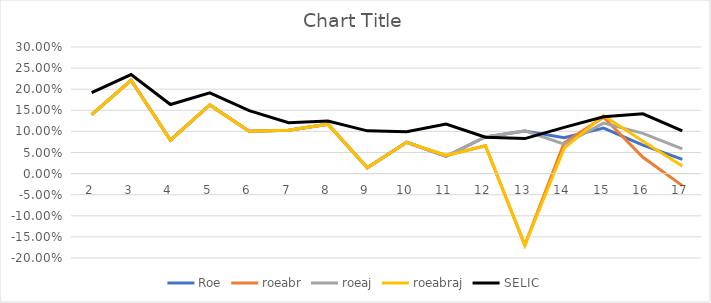
| Category | Roe | roeabr | roeaj | roeabraj | SELIC |
|---|---|---|---|---|---|
| 2.0 | 0.14 | 0.14 | 0.14 | 0.14 | 0.192 |
| 3.0 | 0.221 | 0.221 | 0.221 | 0.221 | 0.235 |
| 4.0 | 0.079 | 0.079 | 0.079 | 0.079 | 0.164 |
| 5.0 | 0.163 | 0.163 | 0.163 | 0.163 | 0.191 |
| 6.0 | 0.1 | 0.1 | 0.1 | 0.1 | 0.149 |
| 7.0 | 0.103 | 0.103 | 0.103 | 0.103 | 0.12 |
| 8.0 | 0.117 | 0.117 | 0.117 | 0.117 | 0.124 |
| 9.0 | 0.014 | 0.014 | 0.014 | 0.014 | 0.101 |
| 10.0 | 0.074 | 0.074 | 0.074 | 0.074 | 0.099 |
| 11.0 | 0.041 | 0.043 | 0.041 | 0.043 | 0.118 |
| 12.0 | 0.087 | 0.066 | 0.087 | 0.066 | 0.086 |
| 13.0 | 0.101 | -0.17 | 0.101 | -0.17 | 0.083 |
| 14.0 | 0.085 | 0.073 | 0.07 | 0.06 | 0.11 |
| 15.0 | 0.108 | 0.134 | 0.12 | 0.137 | 0.135 |
| 16.0 | 0.067 | 0.039 | 0.095 | 0.077 | 0.142 |
| 17.0 | 0.034 | -0.029 | 0.058 | 0.018 | 0.101 |